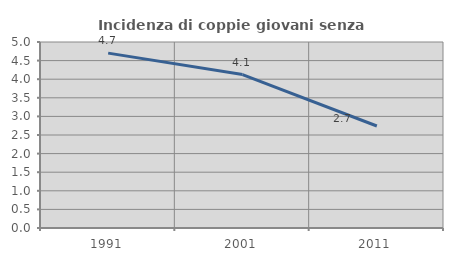
| Category | Incidenza di coppie giovani senza figli |
|---|---|
| 1991.0 | 4.701 |
| 2001.0 | 4.124 |
| 2011.0 | 2.742 |